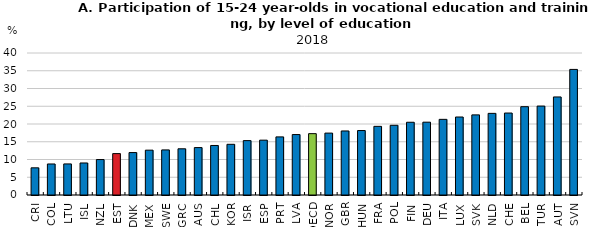
| Category | Series 0 |
|---|---|
| CRI | 7.657 |
| COL | 8.74 |
| LTU | 8.751 |
| ISL | 9.022 |
| NZL | 9.984 |
| EST | 11.664 |
| DNK | 11.953 |
| MEX | 12.628 |
| SWE | 12.698 |
| GRC | 13.016 |
| AUS | 13.358 |
| CHL | 13.949 |
| KOR | 14.28 |
| ISR | 15.321 |
| ESP | 15.446 |
| PRT | 16.366 |
| LVA | 17.028 |
| OECD | 17.283 |
| NOR | 17.438 |
| GBR | 18.038 |
| HUN | 18.158 |
| FRA | 19.338 |
| POL | 19.638 |
| FIN | 20.491 |
| DEU | 20.514 |
| ITA | 21.31 |
| LUX | 21.971 |
| SVK | 22.57 |
| NLD | 22.993 |
| CHE | 23.088 |
| BEL | 24.877 |
| TUR | 25.05 |
| AUT | 27.62 |
| SVN | 35.378 |